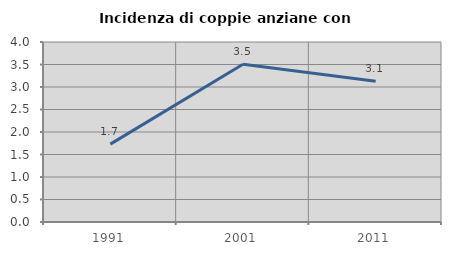
| Category | Incidenza di coppie anziane con figli |
|---|---|
| 1991.0 | 1.731 |
| 2001.0 | 3.504 |
| 2011.0 | 3.129 |